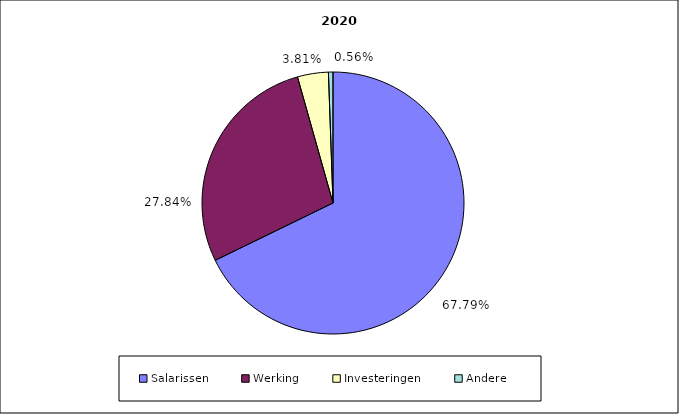
| Category | 2020 |
|---|---|
| Salarissen | 8718668 |
| Werking | 3580591.435 |
| Investeringen | 490110 |
| Andere | 72003 |